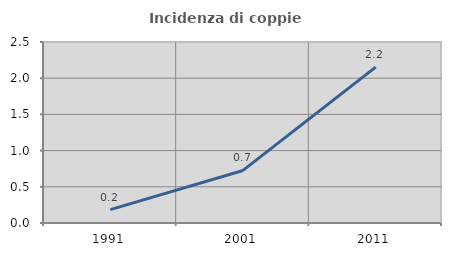
| Category | Incidenza di coppie miste |
|---|---|
| 1991.0 | 0.184 |
| 2001.0 | 0.726 |
| 2011.0 | 2.153 |